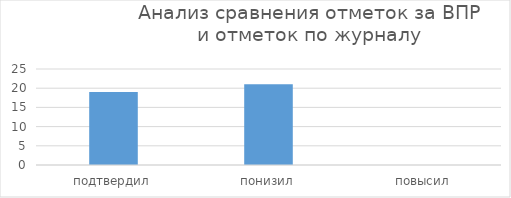
| Category | Series 0 |
|---|---|
| подтвердил | 19 |
| понизил | 21 |
| повысил | 0 |